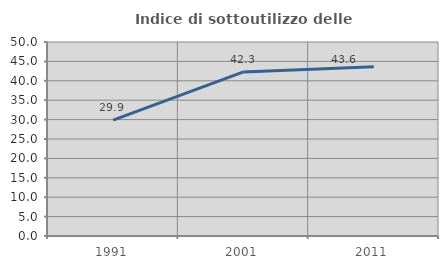
| Category | Indice di sottoutilizzo delle abitazioni  |
|---|---|
| 1991.0 | 29.873 |
| 2001.0 | 42.276 |
| 2011.0 | 43.612 |